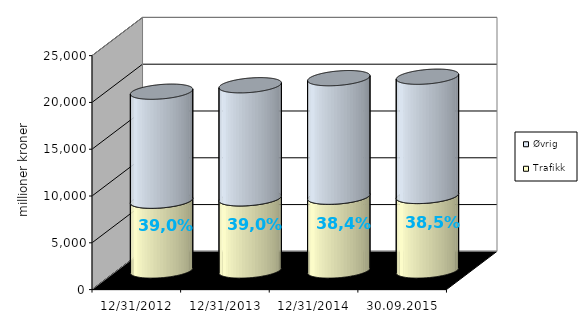
| Category | Trafikk | Øvrig |
|---|---|---|
| 31.12.2012 | 7457.552 | 11647.433 |
| 31.12.2013 | 7709.892 | 12083.527 |
| 31.12.2014 | 7884.668 | 12665.925 |
| 30.09.2015 | 7963.771 | 12741.527 |